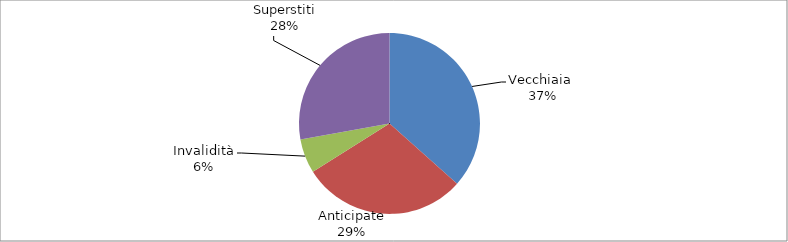
| Category | Series 0 |
|---|---|
| Vecchiaia  | 27625 |
| Anticipate | 22265 |
| Invalidità | 4615 |
| Superstiti | 21003 |